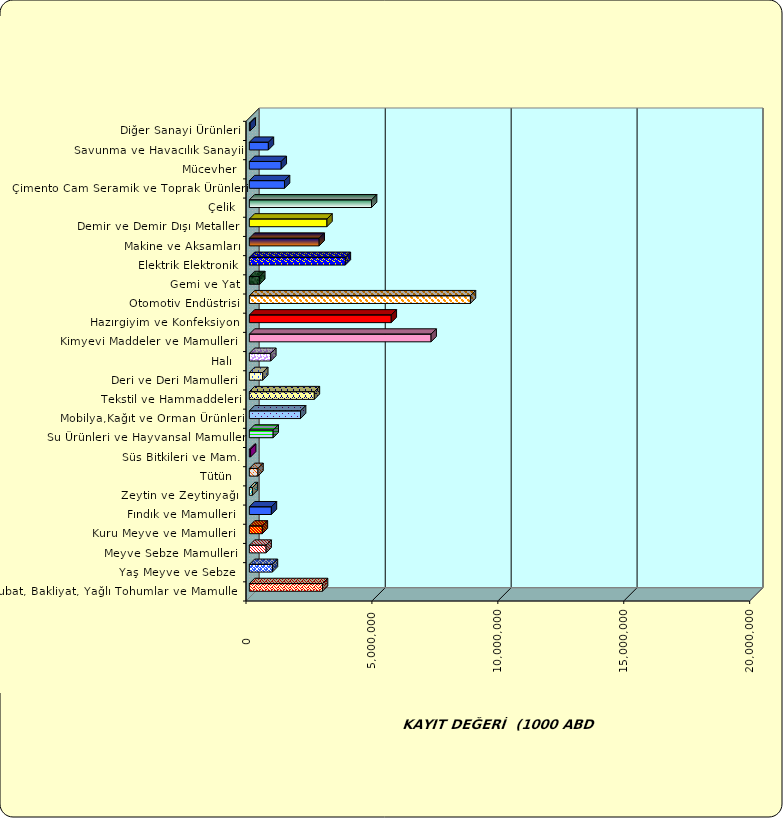
| Category | Series 0 |
|---|---|
|  Hububat, Bakliyat, Yağlı Tohumlar ve Mamulleri  | 2904535.307 |
|  Yaş Meyve ve Sebze   | 915367.826 |
|  Meyve Sebze Mamulleri  | 665339.115 |
|  Kuru Meyve ve Mamulleri   | 515230.466 |
|  Fındık ve Mamulleri  | 874921.103 |
|  Zeytin ve Zeytinyağı  | 121836.694 |
|  Tütün  | 341811.989 |
|  Süs Bitkileri ve Mam. | 49948.849 |
|  Su Ürünleri ve Hayvansal Mamuller | 945856.562 |
|  Mobilya,Kağıt ve Orman Ürünleri | 2032746.95 |
|  Tekstil ve Hammaddeleri | 2580768.517 |
|  Deri ve Deri Mamulleri  | 530288.167 |
|  Halı  | 851602.156 |
|  Kimyevi Maddeler ve Mamulleri   | 7216725.736 |
|  Hazırgiyim ve Konfeksiyon  | 5634863.533 |
|  Otomotiv Endüstrisi | 8778684.346 |
|  Gemi ve Yat | 412235.928 |
|  Elektrik Elektronik | 3811472.034 |
|  Makine ve Aksamları | 2772965.57 |
|  Demir ve Demir Dışı Metaller  | 3081745.588 |
|  Çelik | 4851998.01 |
|  Çimento Cam Seramik ve Toprak Ürünleri | 1396227.088 |
|  Mücevher | 1265536.471 |
|  Savunma ve Havacılık Sanayii | 755671.193 |
|  Diğer Sanayi Ürünleri | 34793.196 |